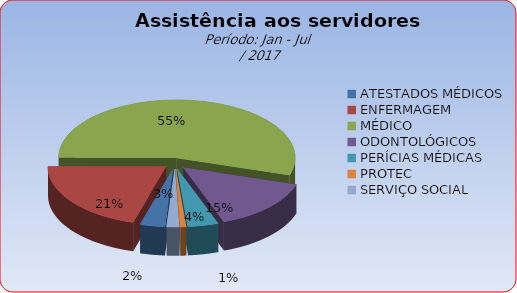
| Category | Series 0 |
|---|---|
| ATESTADOS MÉDICOS | 3.394 |
| ENFERMAGEM | 20.518 |
| MÉDICO | 54.767 |
| ODONTOLÓGICOS | 14.637 |
| PERÍCIAS MÉDICAS | 4.171 |
| PROTEC | 0.803 |
| SERVIÇO SOCIAL | 1.71 |